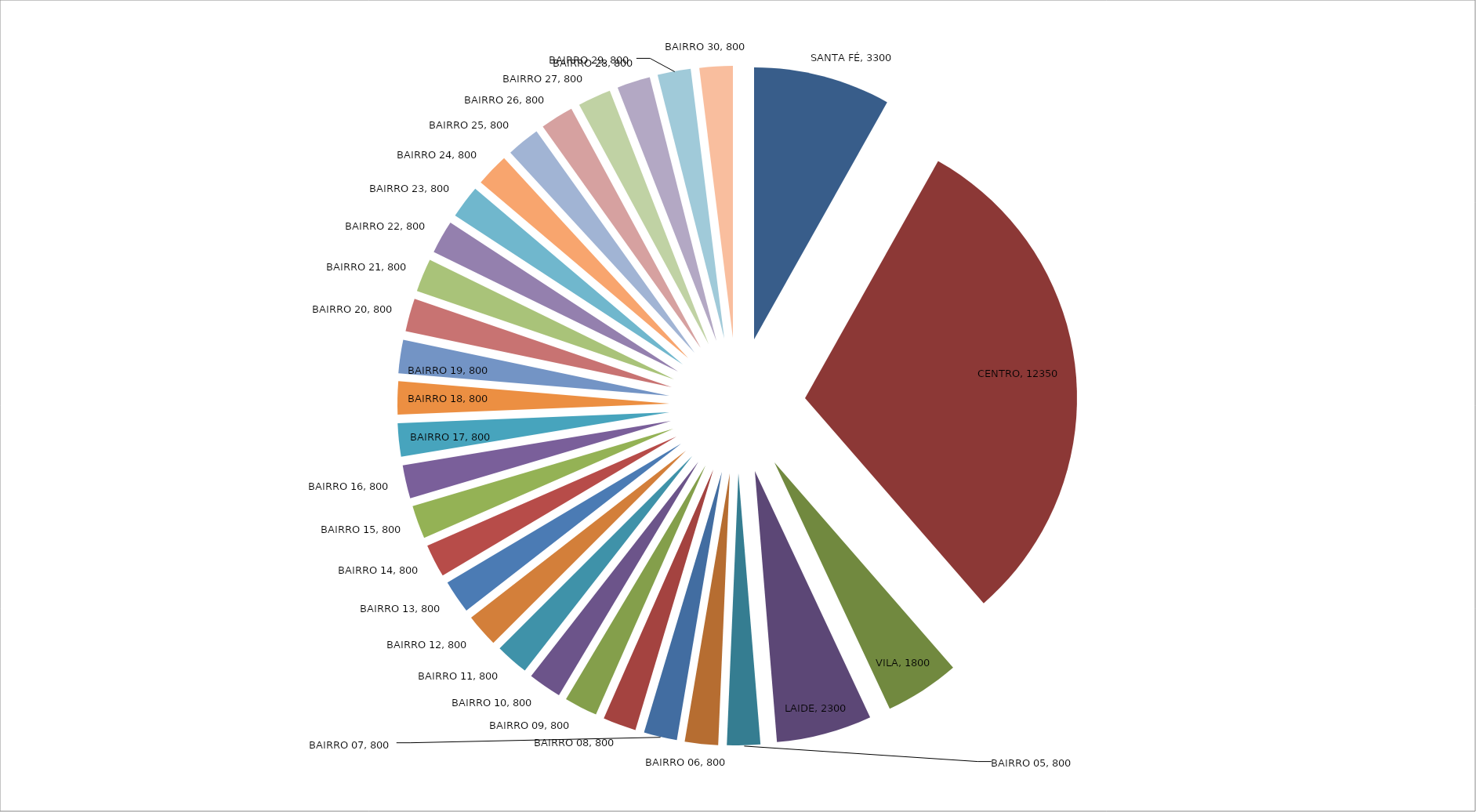
| Category | VENDA SOBRE BAIRROS |
|---|---|
| SANTA FÉ | 3300 |
| CENTRO | 12350 |
| VILA | 1800 |
| LAIDE | 2300 |
| BAIRRO 05 | 800 |
| BAIRRO 06 | 800 |
| BAIRRO 07 | 800 |
| BAIRRO 08 | 800 |
| BAIRRO 09 | 800 |
| BAIRRO 10 | 800 |
| BAIRRO 11 | 800 |
| BAIRRO 12 | 800 |
| BAIRRO 13 | 800 |
| BAIRRO 14 | 800 |
| BAIRRO 15 | 800 |
| BAIRRO 16 | 800 |
| BAIRRO 17 | 800 |
| BAIRRO 18 | 800 |
| BAIRRO 19 | 800 |
| BAIRRO 20 | 800 |
| BAIRRO 21 | 800 |
| BAIRRO 22 | 800 |
| BAIRRO 23 | 800 |
| BAIRRO 24 | 800 |
| BAIRRO 25 | 800 |
| BAIRRO 26 | 800 |
| BAIRRO 27 | 800 |
| BAIRRO 28 | 800 |
| BAIRRO 29 | 800 |
| BAIRRO 30 | 800 |